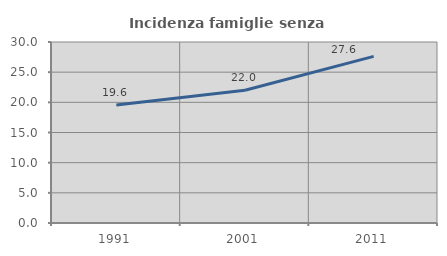
| Category | Incidenza famiglie senza nuclei |
|---|---|
| 1991.0 | 19.563 |
| 2001.0 | 21.991 |
| 2011.0 | 27.621 |